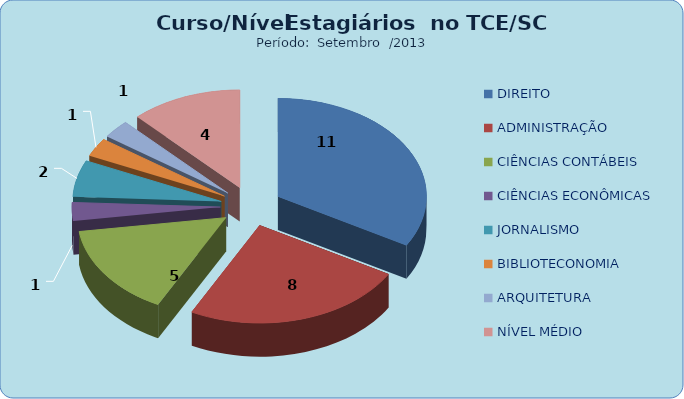
| Category | Series 0 |
|---|---|
| DIREITO | 11 |
| ADMINISTRAÇÃO | 8 |
| CIÊNCIAS CONTÁBEIS | 5 |
| CIÊNCIAS ECONÔMICAS | 1 |
| JORNALISMO | 2 |
| BIBLIOTECONOMIA | 1 |
| ARQUITETURA | 1 |
| NÍVEL MÉDIO | 4 |